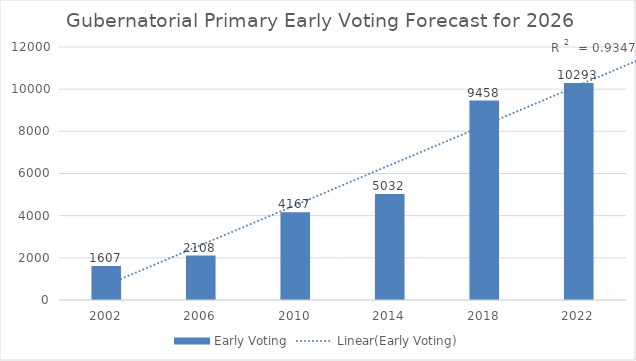
| Category | Early Voting |
|---|---|
| 2002.0 | 1607 |
| 2006.0 | 2108 |
| 2010.0 | 4167 |
| 2014.0 | 5032 |
| 2018.0 | 9458 |
| 2022.0 | 10293 |